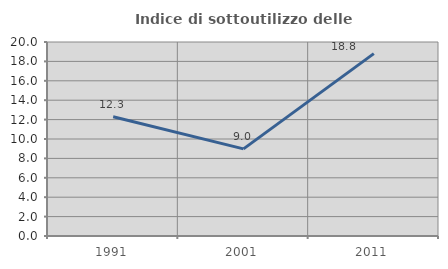
| Category | Indice di sottoutilizzo delle abitazioni  |
|---|---|
| 1991.0 | 12.286 |
| 2001.0 | 8.986 |
| 2011.0 | 18.801 |